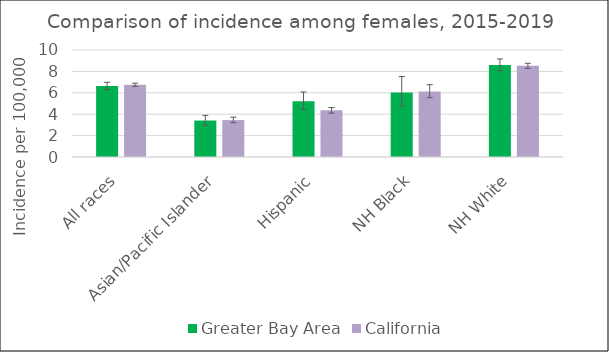
| Category | Greater Bay Area | California | SEER 18 |
|---|---|---|---|
| All races | 6.64 | 6.75 |  |
| Asian/Pacific Islander | 3.41 | 3.45 |  |
| Hispanic | 5.22 | 4.36 |  |
| NH Black | 6.02 | 6.13 |  |
| NH White | 8.6 | 8.52 |  |